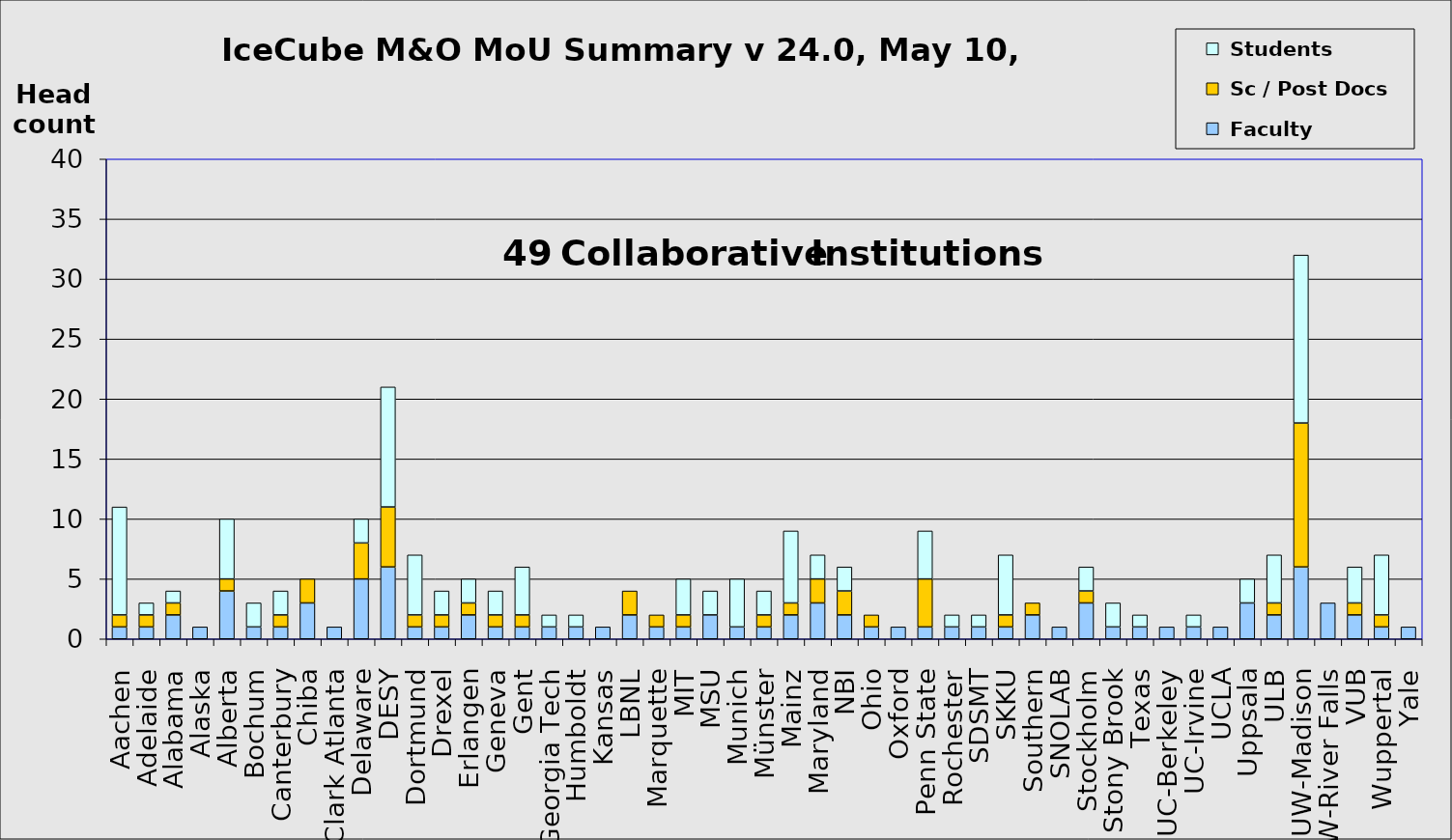
| Category |  Faculty |  Sc / Post Docs |  Students |
|---|---|---|---|
| Aachen | 1 | 1 | 9 |
| Adelaide | 1 | 1 | 1 |
| Alabama | 2 | 1 | 1 |
| Alaska | 1 | 0 | 0 |
| Alberta | 4 | 1 | 5 |
| Bochum | 1 | 0 | 2 |
| Canterbury | 1 | 1 | 2 |
| Chiba | 3 | 2 | 0 |
| Clark Atlanta | 1 | 0 | 0 |
| Delaware | 5 | 3 | 2 |
| DESY | 6 | 5 | 10 |
| Dortmund | 1 | 1 | 5 |
| Drexel | 1 | 1 | 2 |
| Erlangen | 2 | 1 | 2 |
| Geneva | 1 | 1 | 2 |
| Gent | 1 | 1 | 4 |
| Georgia Tech | 1 | 0 | 1 |
| Humboldt | 1 | 0 | 1 |
| Kansas | 1 | 0 | 0 |
| LBNL | 2 | 2 | 0 |
| Marquette | 1 | 1 | 0 |
| MIT | 1 | 1 | 3 |
| MSU | 2 | 0 | 2 |
| Munich | 1 | 0 | 4 |
| Münster | 1 | 1 | 2 |
| Mainz | 2 | 1 | 6 |
| Maryland | 3 | 2 | 2 |
| NBI | 2 | 2 | 2 |
| Ohio | 1 | 1 | 0 |
| Oxford | 1 | 0 | 0 |
| Penn State | 1 | 4 | 4 |
| Rochester | 1 | 0 | 1 |
| SDSMT | 1 | 0 | 1 |
| SKKU | 1 | 1 | 5 |
| Southern | 2 | 1 | 0 |
| SNOLAB | 1 | 0 | 0 |
| Stockholm | 3 | 1 | 2 |
| Stony Brook | 1 | 0 | 2 |
| Texas | 1 | 0 | 1 |
| UC-Berkeley | 1 | 0 | 0 |
| UC-Irvine | 1 | 0 | 1 |
| UCLA | 1 | 0 | 0 |
| Uppsala | 3 | 0 | 2 |
| ULB | 2 | 1 | 4 |
| UW-Madison | 6 | 12 | 14 |
| UW-River Falls | 3 | 0 | 0 |
| VUB | 2 | 1 | 3 |
| Wuppertal | 1 | 1 | 5 |
| Yale | 1 | 0 | 0 |